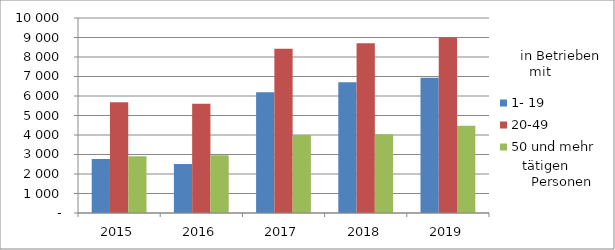
| Category | 1- 19 | 20-49 | 50 und mehr |
|---|---|---|---|
| 2015.0 | 2771 | 5678 | 2913 |
| 2016.0 | 2511 | 5598 | 2967 |
| 2017.0 | 6188 | 8425 | 4004 |
| 2018.0 | 6705 | 8702 | 4036 |
| 2019.0 | 6930 | 9003 | 4480 |